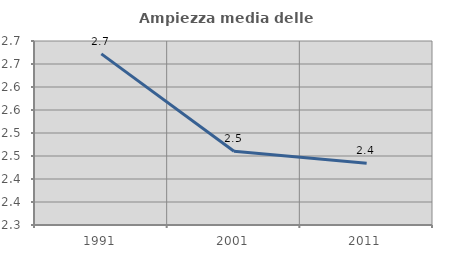
| Category | Ampiezza media delle famiglie |
|---|---|
| 1991.0 | 2.672 |
| 2001.0 | 2.46 |
| 2011.0 | 2.434 |